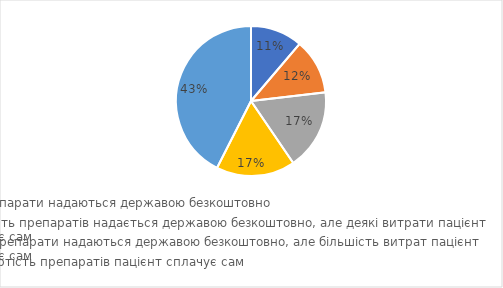
| Category | Series 0 |
|---|---|
| Всі препарати надаються державою безкоштовно | 0.112 |
| Більшість препаратів надається державою безкоштовно, але деякі витрати пацієнт сплачує сам | 0.119 |
| Деякі препарати надаються державою безкоштовно, але більшість витрат пацієнт сплачує сам | 0.173 |
| Всю вартість препаратів пацієнт сплачує сам | 0.17 |
| НЕ ЗНАЮ | 0.425 |